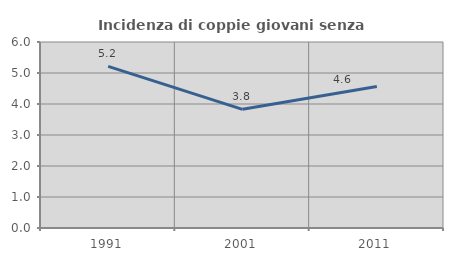
| Category | Incidenza di coppie giovani senza figli |
|---|---|
| 1991.0 | 5.214 |
| 2001.0 | 3.827 |
| 2011.0 | 4.562 |